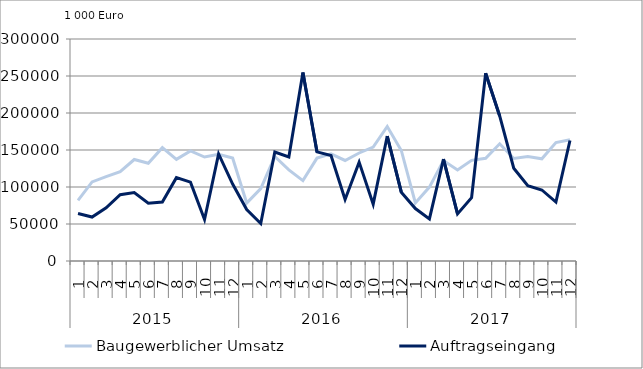
| Category | Baugewerblicher Umsatz | Auftragseingang |
|---|---|---|
| 0 | 81937.361 | 64244.383 |
| 1 | 106908.454 | 59377.677 |
| 2 | 113904.285 | 71953.971 |
| 3 | 120612.446 | 89496.024 |
| 4 | 137142.75 | 92563.213 |
| 5 | 132019.811 | 78131.737 |
| 6 | 153125.961 | 79765.729 |
| 7 | 137370.133 | 112637.987 |
| 8 | 148792.629 | 106572.56 |
| 9 | 140483.911 | 56073.767 |
| 10 | 144146.162 | 144643.688 |
| 11 | 139085.889 | 103931.175 |
| 12 | 78291.738 | 69470.357 |
| 13 | 97863.379 | 50640.033 |
| 14 | 141176.119 | 147206.65 |
| 15 | 123121.297 | 140579.009 |
| 16 | 108561.124 | 254739.334 |
| 17 | 139030.209 | 147481.644 |
| 18 | 144784.416 | 142609.658 |
| 19 | 135870.195 | 83192.156 |
| 20 | 145961.738 | 133594.351 |
| 21 | 153886.826 | 76793.838 |
| 22 | 181740.037 | 168867.568 |
| 23 | 149348.138 | 93011.853 |
| 24 | 78446.78 | 70908.903 |
| 25 | 99841.908 | 56868.408 |
| 26 | 135679.867 | 137790.423 |
| 27 | 123004.403 | 63637.761 |
| 28 | 136010.071 | 85644.63 |
| 29 | 138859.308 | 253791.552 |
| 30 | 158353.879 | 196034.198 |
| 31 | 138510.315 | 125319.873 |
| 32 | 141109.925 | 101690.626 |
| 33 | 138067.098 | 95966.626 |
| 34 | 160064.454 | 79701.993 |
| 35 | 163969.017 | 162878.607 |